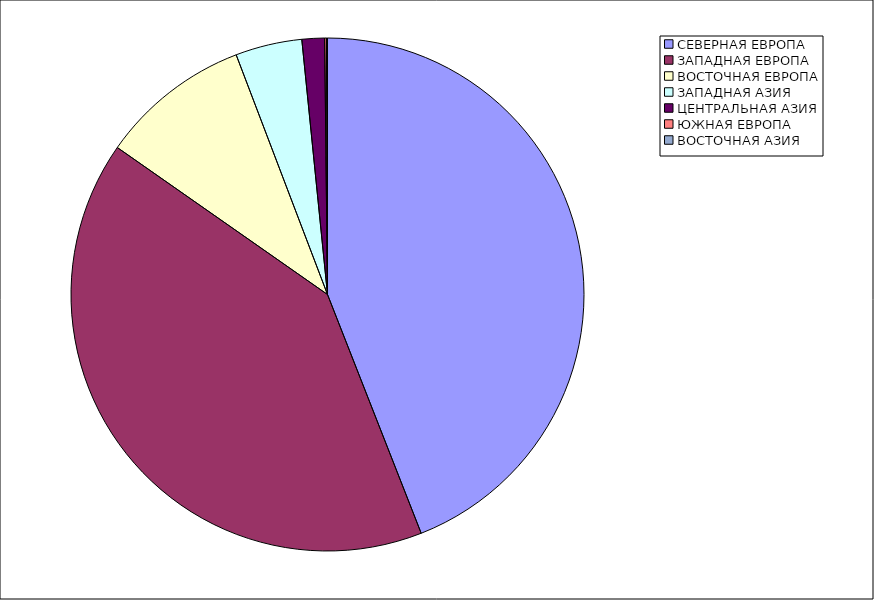
| Category | Оборот |
|---|---|
| СЕВЕРНАЯ ЕВРОПА | 44.047 |
| ЗАПАДНАЯ ЕВРОПА | 40.665 |
| ВОСТОЧНАЯ ЕВРОПА | 9.493 |
| ЗАПАДНАЯ АЗИЯ | 4.195 |
| ЦЕНТРАЛЬНАЯ АЗИЯ | 1.424 |
| ЮЖНАЯ ЕВРОПА | 0.113 |
| ВОСТОЧНАЯ АЗИЯ | 0.063 |